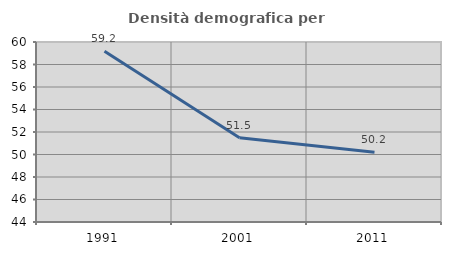
| Category | Densità demografica |
|---|---|
| 1991.0 | 59.169 |
| 2001.0 | 51.497 |
| 2011.0 | 50.206 |